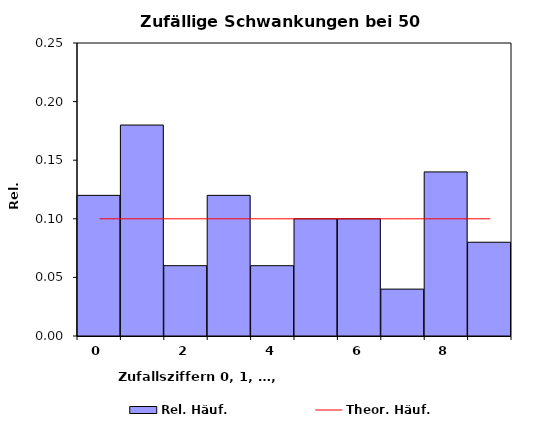
| Category | Rel. Häuf. |
|---|---|
| 0.0 | 0.12 |
| 1.0 | 0.18 |
| 2.0 | 0.06 |
| 3.0 | 0.12 |
| 4.0 | 0.06 |
| 5.0 | 0.1 |
| 6.0 | 0.1 |
| 7.0 | 0.04 |
| 8.0 | 0.14 |
| 9.0 | 0.08 |